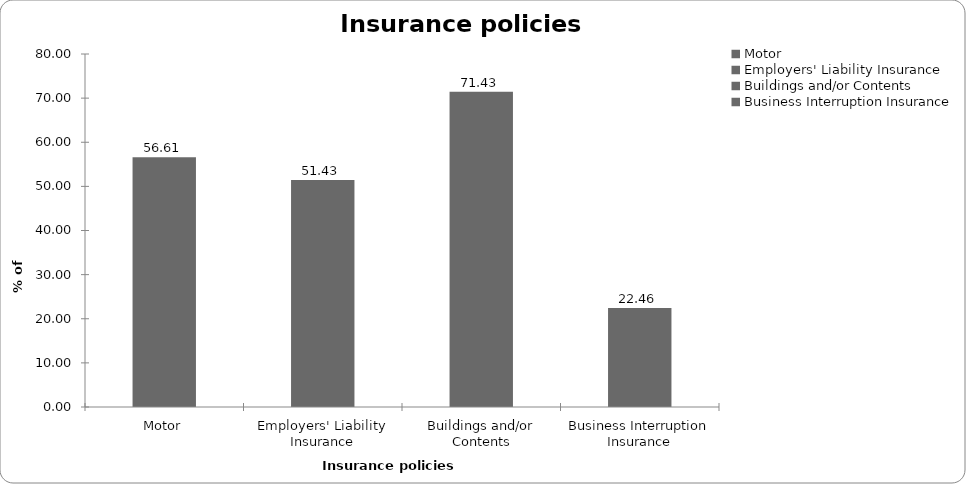
| Category | Series 0 |
|---|---|
| Motor | 56.611 |
| Employers' Liability Insurance | 51.429 |
| Buildings and/or Contents | 71.429 |
| Business Interruption Insurance | 22.458 |